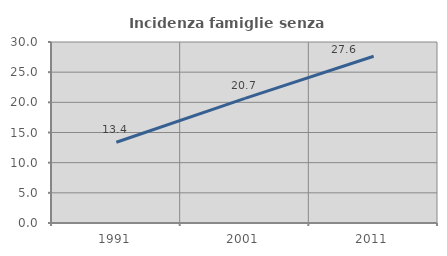
| Category | Incidenza famiglie senza nuclei |
|---|---|
| 1991.0 | 13.391 |
| 2001.0 | 20.657 |
| 2011.0 | 27.646 |